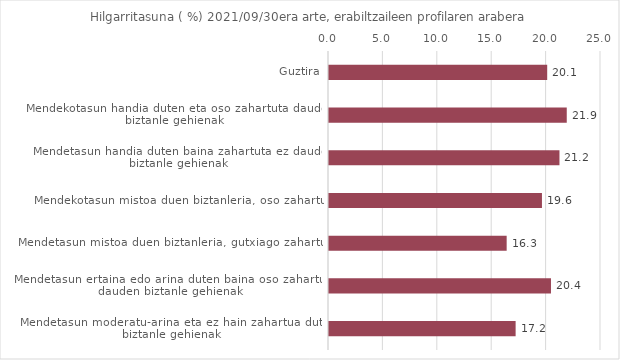
| Category | Series 0 |
|---|---|
| Guztira | 20.055 |
| Mendekotasun handia duten eta oso zahartuta dauden biztanle gehienak | 21.852 |
| Mendetasun handia duten baina zahartuta ez dauden biztanle gehienak | 21.182 |
| Mendekotasun mistoa duen biztanleria, oso zahartua | 19.573 |
| Mendetasun mistoa duen biztanleria, gutxiago zahartua | 16.329 |
| Mendetasun ertaina edo arina duten baina oso zahartuta dauden biztanle gehienak | 20.402 |
| Mendetasun moderatu-arina eta ez hain zahartua duten biztanle gehienak | 17.153 |